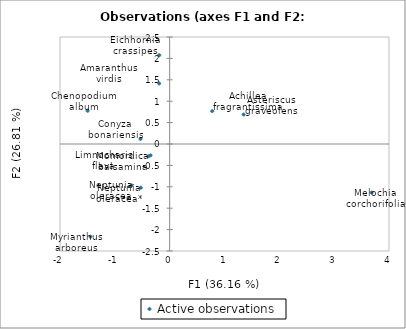
| Category | Active observations |
|---|---|
| -0.18985142307214994 | 2.074 |
| -0.34824750131828675 | -0.265 |
| -0.6954448638487807 | -0.966 |
| -0.5249164801427102 | -1.021 |
| 3.682361526996832 | -1.134 |
| -0.38583264758421804 | -0.286 |
| -1.4446615818403221 | -2.165 |
| 0.7769635712191573 | 0.768 |
| -0.19138517943807243 | 1.415 |
| 1.3491463546381932 | 0.688 |
| -1.4958597998016077 | 0.775 |
| -0.5322719758080349 | 0.118 |